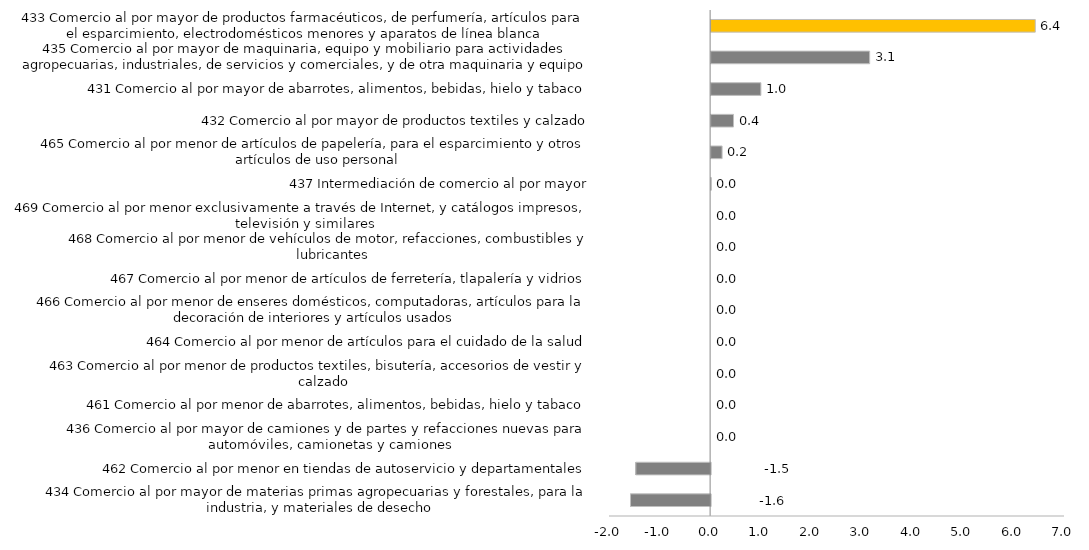
| Category | 2018 3er t |
|---|---|
| 434 Comercio al por mayor de materias primas agropecuarias y forestales, para la industria, y materiales de desecho | -1.584 |
| 462 Comercio al por menor en tiendas de autoservicio y departamentales | -1.479 |
| 436 Comercio al por mayor de camiones y de partes y refacciones nuevas para automóviles, camionetas y camiones | 0 |
| 461 Comercio al por menor de abarrotes, alimentos, bebidas, hielo y tabaco | 0 |
| 463 Comercio al por menor de productos textiles, bisutería, accesorios de vestir y calzado | 0 |
| 464 Comercio al por menor de artículos para el cuidado de la salud | 0 |
| 466 Comercio al por menor de enseres domésticos, computadoras, artículos para la decoración de interiores y artículos usados | 0 |
| 467 Comercio al por menor de artículos de ferretería, tlapalería y vidrios | 0 |
| 468 Comercio al por menor de vehículos de motor, refacciones, combustibles y lubricantes | 0 |
| 469 Comercio al por menor exclusivamente a través de Internet, y catálogos impresos, televisión y similares | 0 |
| 437 Intermediación de comercio al por mayor | 0.003 |
| 465 Comercio al por menor de artículos de papelería, para el esparcimiento y otros artículos de uso personal | 0.217 |
| 432 Comercio al por mayor de productos textiles y calzado | 0.443 |
| 431 Comercio al por mayor de abarrotes, alimentos, bebidas, hielo y tabaco | 0.985 |
| 435 Comercio al por mayor de maquinaria, equipo y mobiliario para actividades agropecuarias, industriales, de servicios y comerciales, y de otra maquinaria y equipo de uso general | 3.136 |
| 433 Comercio al por mayor de productos farmacéuticos, de perfumería, artículos para el esparcimiento, electrodomésticos menores y aparatos de línea blanca | 6.412 |